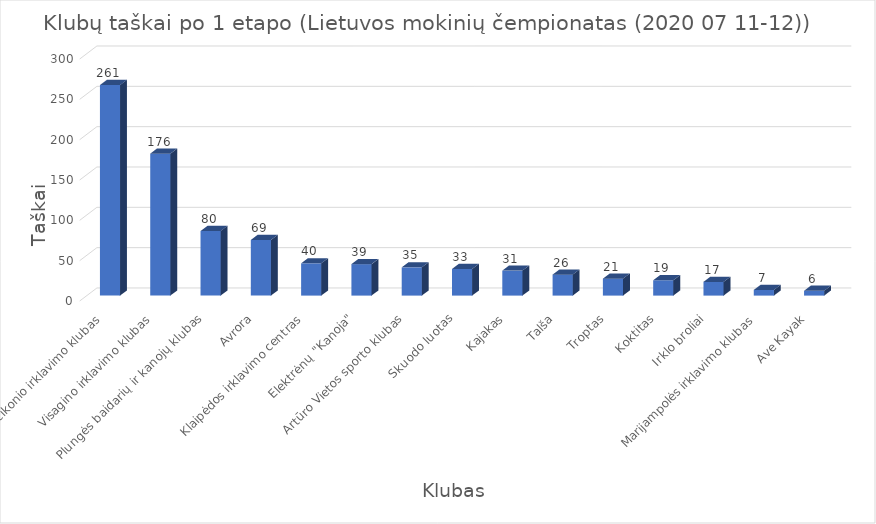
| Category | Series 0 |
|---|---|
| V. Vaičikonio irklavimo klubas | 261 |
| Visagino irklavimo klubas | 176 |
| Plungės baidarių ir kanojų klubas | 80 |
| Avrora | 69 |
| Klaipėdos irklavimo centras | 40 |
| Elektrėnų "Kanoja" | 39 |
| Artūro Vietos sporto klubas | 35 |
| Skuodo luotas | 33 |
| Kajakas | 31 |
| Talša | 26 |
| Troptas | 21 |
| Koktitas | 19 |
| Irklo broliai | 17 |
| Marijampolės irklavimo klubas | 7 |
| Ave Kayak | 6 |